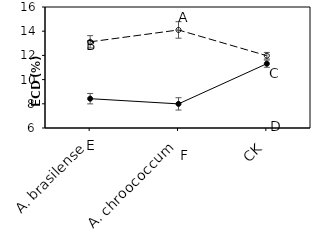
| Category | Bt | Xy |
|---|---|---|
|    A. brasilense | 8.424 | 13.122 |
|    A. chroococcum | 7.993 | 14.103 |
| CK | 11.314 | 11.975 |